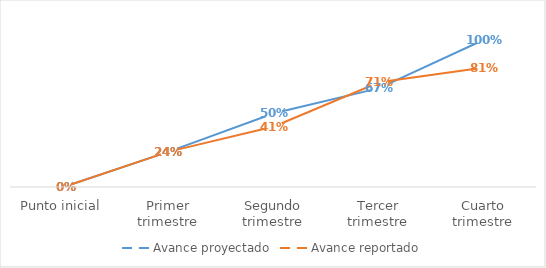
| Category | Avance proyectado | Avance reportado |
|---|---|---|
| Punto inicial | 0 | 0 |
| Primer trimestre | 0.24 | 0.24 |
| Segundo trimestre | 0.5 | 0.41 |
| Tercer trimestre | 0.67 | 0.71 |
| Cuarto trimestre | 1 | 0.81 |